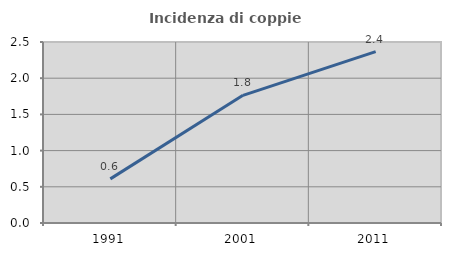
| Category | Incidenza di coppie miste |
|---|---|
| 1991.0 | 0.609 |
| 2001.0 | 1.763 |
| 2011.0 | 2.367 |